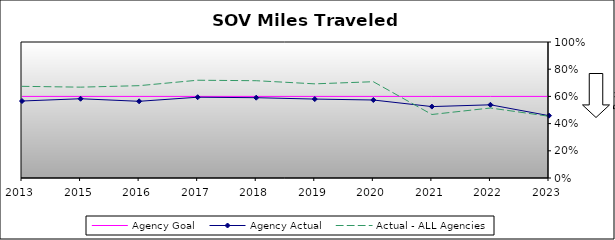
| Category | Agency Goal | Agency Actual | Actual - ALL Agencies |
|---|---|---|---|
| 2013.0 | 0.6 | 0.566 | 0.674 |
| 2015.0 | 0.6 | 0.583 | 0.668 |
| 2016.0 | 0.6 | 0.564 | 0.679 |
| 2017.0 | 0.6 | 0.594 | 0.719 |
| 2018.0 | 0.6 | 0.59 | 0.715 |
| 2019.0 | 0.6 | 0.58 | 0.692 |
| 2020.0 | 0.6 | 0.574 | 0.708 |
| 2021.0 | 0.6 | 0.525 | 0.467 |
| 2022.0 | 0.6 | 0.538 | 0.515 |
| 2023.0 | 0.6 | 0.458 | 0.454 |